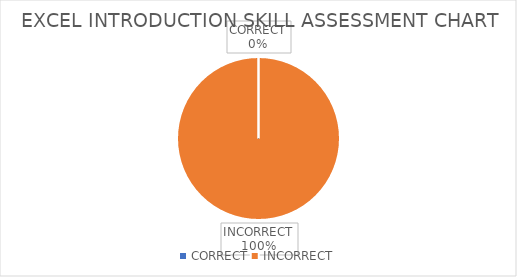
| Category | Series 0 |
|---|---|
| CORRECT | 0 |
| INCORRECT | 22 |